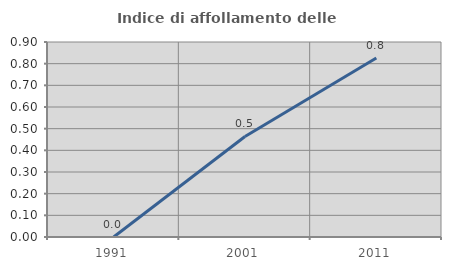
| Category | Indice di affollamento delle abitazioni  |
|---|---|
| 1991.0 | 0 |
| 2001.0 | 0.464 |
| 2011.0 | 0.826 |